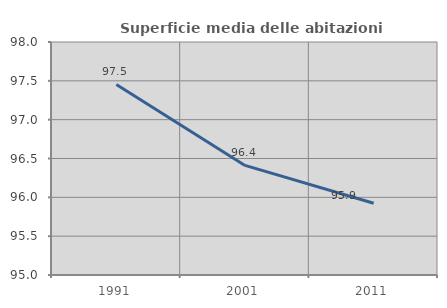
| Category | Superficie media delle abitazioni occupate |
|---|---|
| 1991.0 | 97.453 |
| 2001.0 | 96.411 |
| 2011.0 | 95.924 |